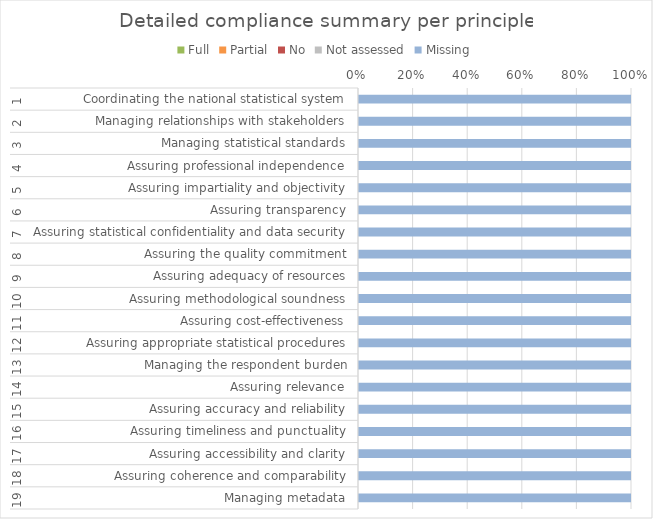
| Category | Full | Partial | No | Not assessed | Missing |
|---|---|---|---|---|---|
| 0 | 0 | 0 | 0 | 0 | 4 |
| 1 | 0 | 0 | 0 | 0 | 7 |
| 2 | 0 | 0 | 0 | 0 | 3 |
| 3 | 0 | 0 | 0 | 0 | 3 |
| 4 | 0 | 0 | 0 | 0 | 7 |
| 5 | 0 | 0 | 0 | 0 | 2 |
| 6 | 0 | 0 | 0 | 0 | 6 |
| 7 | 0 | 0 | 0 | 0 | 8 |
| 8 | 0 | 0 | 0 | 0 | 3 |
| 9 | 0 | 0 | 0 | 0 | 5 |
| 10 | 0 | 0 | 0 | 0 | 6 |
| 11 | 0 | 0 | 0 | 0 | 5 |
| 12 | 0 | 0 | 0 | 0 | 4 |
| 13 | 0 | 0 | 0 | 0 | 4 |
| 14 | 0 | 0 | 0 | 0 | 3 |
| 15 | 0 | 0 | 0 | 0 | 4 |
| 16 | 0 | 0 | 0 | 0 | 7 |
| 17 | 0 | 0 | 0 | 0 | 3 |
| 18 | 0 | 0 | 0 | 0 | 3 |